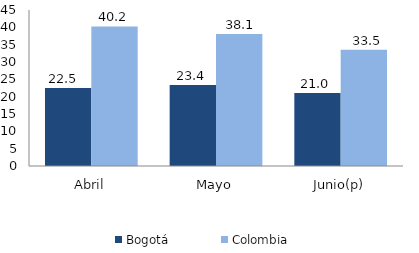
| Category | Bogotá | Colombia |
|---|---|---|
| Abril | 22.492 | 40.244 |
| Mayo | 23.37 | 38.053 |
| Junio(p) | 21.035 | 33.517 |